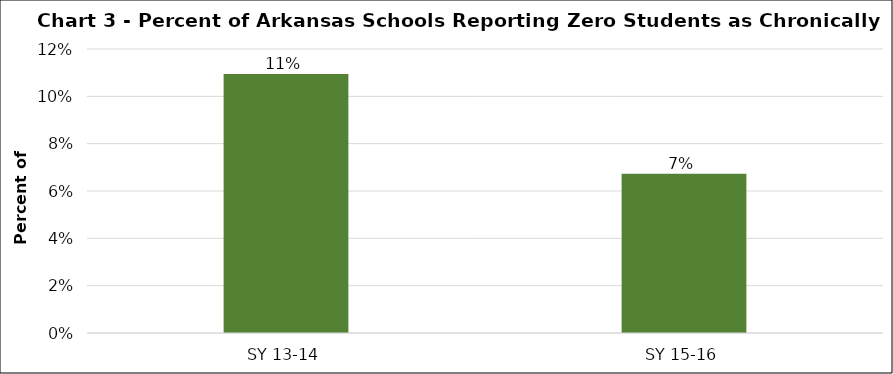
| Category | Series 0 |
|---|---|
| SY 13-14 | 0.109 |
| SY 15-16 | 0.067 |